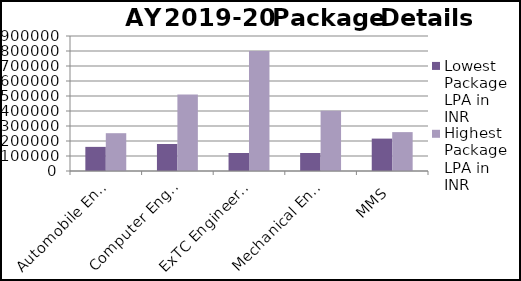
| Category | Lowest Package LPA in INR  | Highest Package LPA in INR  |
|---|---|---|
| Automobile Engineering | 160800 | 252000 |
| Computer Engineering | 180000 | 510298 |
| ExTC Engineering | 120000 | 800000 |
| Mechanical Engineering | 120000 | 401988 |
| MMS | 216000 | 259200 |